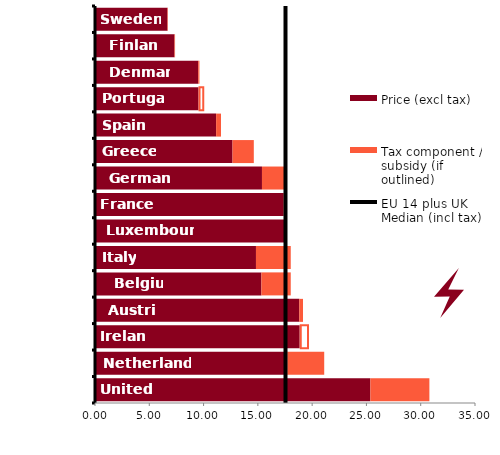
| Category | Price (excl tax) | Tax component / subsidy (if outlined) |
|---|---|---|
| United Kingdom | 25.362 | 5.436 |
| Netherlands | 17.718 | 3.393 |
| Ireland | 18.85 | 0.777 |
| Austria | 18.815 | 0.345 |
| Belgium | 15.327 | 2.703 |
| Italy | 14.826 | 3.203 |
| Luxembourg | 17.563 | 0.078 |
| France | 17.382 | 0.164 |
| Germany | 15.378 | 2.038 |
| Greece | 12.667 | 1.96 |
| Spain | 11.156 | 0.449 |
| Portugal | 9.533 | 0.449 |
| Denmark | 9.507 | 0.112 |
| Finland | 7.322 | 0.052 |
| Sweden | 6.675 | 0.043 |